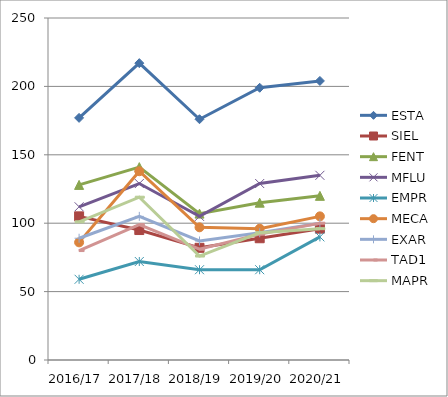
| Category | ESTA | SIEL | FENT | MFLU | EMPR | MECA | EXAR | TAD1 | MAPR |
|---|---|---|---|---|---|---|---|---|---|
| 2016/17 | 177 | 105 | 128 | 112 | 59 | 86 | 89 | 80 | 101 |
| 2017/18 | 217 | 95 | 141 | 129 | 72 | 138 | 105 | 99 | 119 |
| 2018/19 | 176 | 82 | 107 | 105 | 66 | 97 | 87 | 81 | 76 |
| 2019/20 | 199 | 89 | 115 | 129 | 66 | 96 | 93 | 92 | 93 |
| 2020/21 | 204 | 96 | 120 | 135 | 90 | 105 | 100 | 100 | 96 |